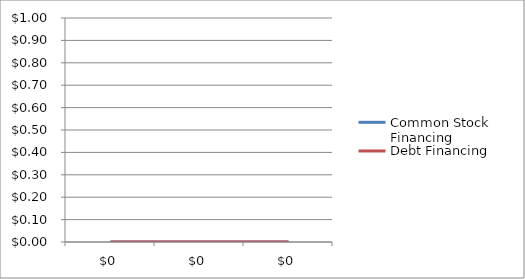
| Category | Common Stock Financing | Debt Financing |
|---|---|---|
| 0.0 | 0 | 0 |
| 0.0 | 0 | 0 |
| 0.0 | 0 | 0 |